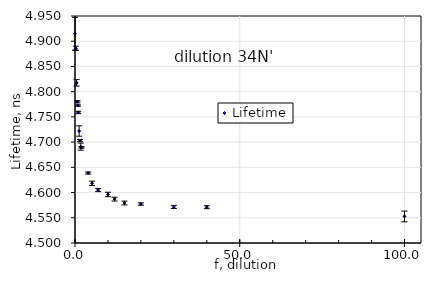
| Category | Lifetime |
|---|---|
| 0.0 | 4.915 |
| 0.25 | 4.886 |
| 0.5 | 4.818 |
| 0.75 | 4.78 |
| 0.875 | 4.772 |
| 1.0 | 4.759 |
| 1.25 | 4.722 |
| 1.5 | 4.703 |
| 1.75 | 4.691 |
| 2.0 | 4.69 |
| 4.0 | 4.639 |
| 5.18 | 4.618 |
| 7.0 | 4.605 |
| 10.0 | 4.596 |
| 12.0 | 4.587 |
| 15.0 | 4.579 |
| 20.0 | 4.577 |
| 30.0 | 4.572 |
| 40.0 | 4.571 |
| 100.0 | 4.553 |